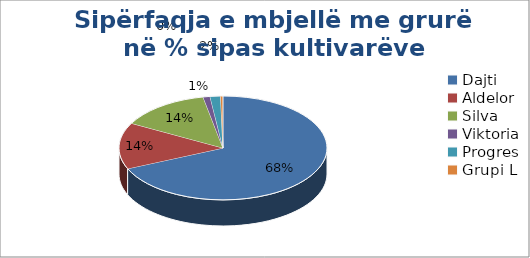
| Category | Series 0 |
|---|---|
| Dajti | 1900 |
| Aldelor | 400 |
| Silva | 390 |
| Viktoria | 30 |
| Progres | 45 |
| Grupi L | 10 |